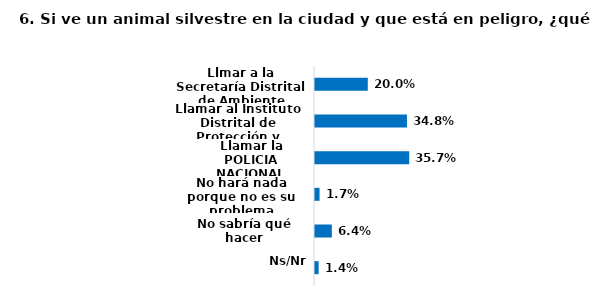
| Category | Series 0 |
|---|---|
| Llmar a la Secretaría Distrital de Ambiente | 0.2 |
| Llamar al Instituto Distrital de Protección y Bienestar Animal | 0.348 |
| Llamar la POLICIA NACIONAL | 0.357 |
| No hará nada porque no es su problema | 0.017 |
| No sabría qué hacer | 0.064 |
| Ns/Nr | 0.014 |